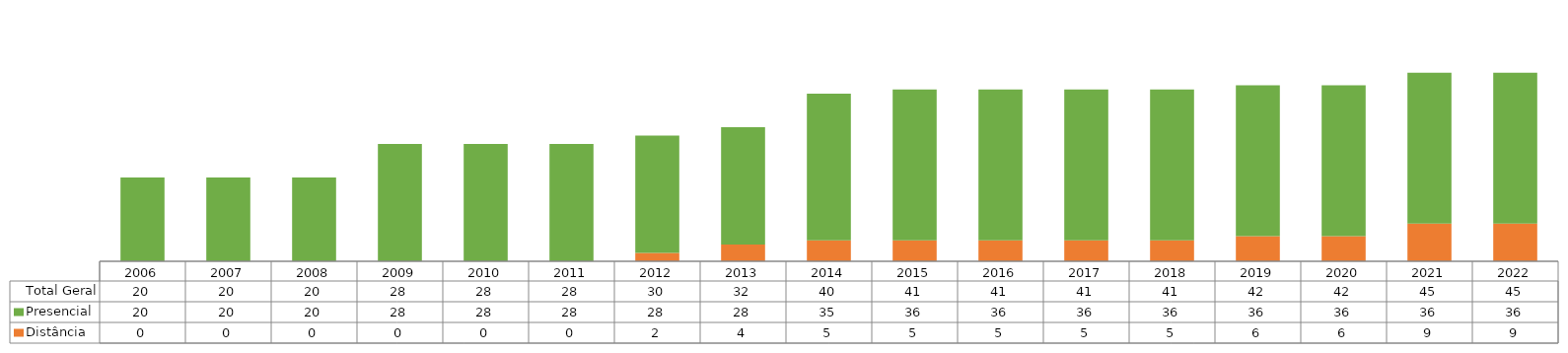
| Category | Distância | Presencial | Total Geral |
|---|---|---|---|
| 2006.0 | 0 | 20 | 20 |
| 2007.0 | 0 | 20 | 20 |
| 2008.0 | 0 | 20 | 20 |
| 2009.0 | 0 | 28 | 28 |
| 2010.0 | 0 | 28 | 28 |
| 2011.0 | 0 | 28 | 28 |
| 2012.0 | 2 | 28 | 30 |
| 2013.0 | 4 | 28 | 32 |
| 2014.0 | 5 | 35 | 40 |
| 2015.0 | 5 | 36 | 41 |
| 2016.0 | 5 | 36 | 41 |
| 2017.0 | 5 | 36 | 41 |
| 2018.0 | 5 | 36 | 41 |
| 2019.0 | 6 | 36 | 42 |
| 2020.0 | 6 | 36 | 42 |
| 2021.0 | 9 | 36 | 45 |
| 2022.0 | 9 | 36 | 45 |